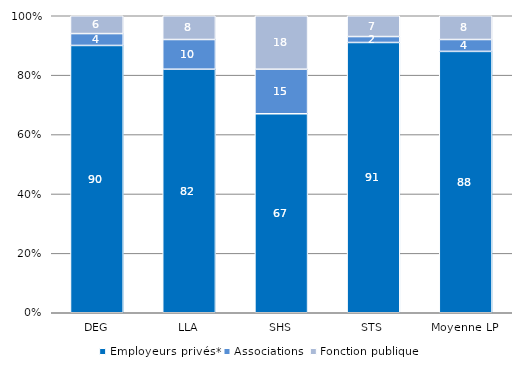
| Category | Employeurs privés* | Associations | Fonction publique |
|---|---|---|---|
| DEG | 90 | 4 | 6 |
| LLA | 82 | 10 | 8 |
| SHS | 67 | 15 | 18 |
| STS | 91 | 2 | 7 |
| Moyenne LP | 88 | 4 | 8 |